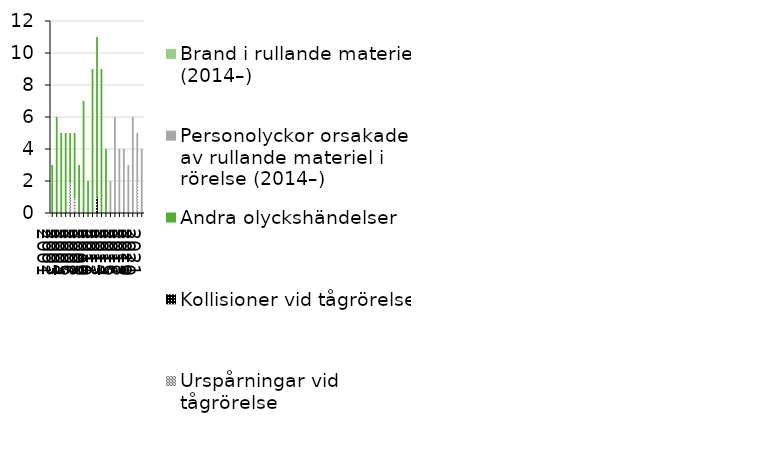
| Category | Urspårningar vid tågrörelse | Kollisioner vid tågrörelse | Andra olyckshändelser | Personolyckor orsakade av rullande materiel i rörelse (2014–) | Brand i rullande materiel (2014–) |
|---|---|---|---|---|---|
| 2001 | 0 | 0 | 3 | 0 | 0 |
| 2002 | 0 | 0 | 6 | 0 | 0 |
| 2003 | 0 | 0 | 5 | 0 | 0 |
| 2004 | 0 | 0 | 5 | 0 | 0 |
| 2005 | 2 | 0 | 3 | 0 | 0 |
| 2006 | 1 | 0 | 4 | 0 | 0 |
| 2007 | 0 | 0 | 3 | 0 | 0 |
| 2008 | 0 | 0 | 7 | 0 | 0 |
| 2009 | 0 | 0 | 2 | 0 | 0 |
| 2010 | 0 | 0 | 9 | 0 | 0 |
| 2011 | 0 | 1 | 10 | 0 | 0 |
| 2012 | 0 | 0 | 9 | 0 | 0 |
| 2013 | 0 | 0 | 4 | 0 | 0 |
| 2014 | 0 | 0 | 0 | 2 | 0 |
| 2015 | 0 | 0 | 0 | 6 | 0 |
| 2016 | 0 | 0 | 0 | 4 | 0 |
| 2017 | 0 | 0 | 0 | 4 | 0 |
| 2018 | 0 | 0 | 0 | 3 | 0 |
| 2019 | 0 | 0 | 0 | 6 | 0 |
| 2020 | 2 | 0 | 0 | 3 | 0 |
| 2021 | 0 | 0 | 0 | 4 | 0 |